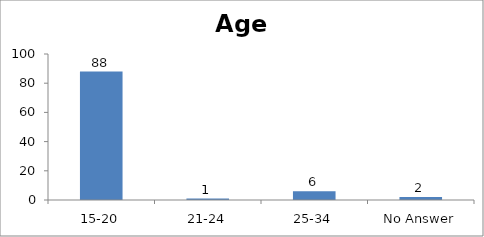
| Category | Age |
|---|---|
| 15-20 | 88 |
| 21-24 | 1 |
| 25-34 | 6 |
| No Answer | 2 |